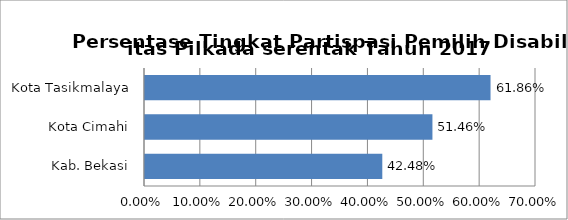
| Category | Series 0 |
|---|---|
| Kab. Bekasi | 0.425 |
| Kota Cimahi | 0.515 |
| Kota Tasikmalaya | 0.619 |